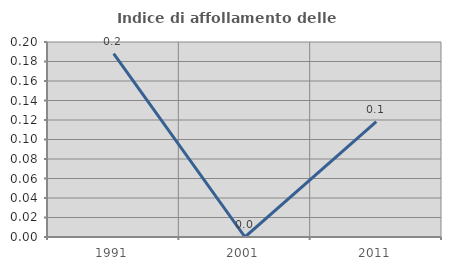
| Category | Indice di affollamento delle abitazioni  |
|---|---|
| 1991.0 | 0.188 |
| 2001.0 | 0 |
| 2011.0 | 0.118 |